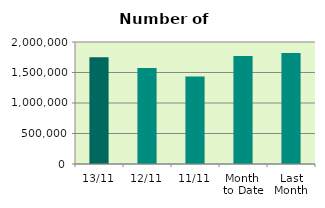
| Category | Series 0 |
|---|---|
| 13/11 | 1747994 |
| 12/11 | 1575542 |
| 11/11 | 1433192 |
| Month 
to Date | 1771705.778 |
| Last
Month | 1817802.609 |